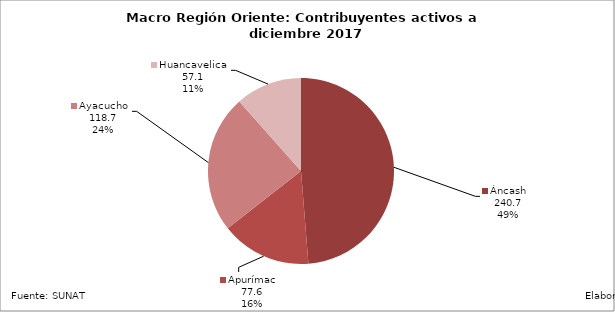
| Category | Contribuyentes |
|---|---|
| Áncash | 240.743 |
| Apurímac | 77.57 |
| Ayacucho | 118.728 |
| Huancavelica | 57.052 |